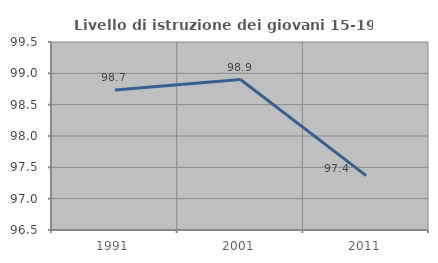
| Category | Livello di istruzione dei giovani 15-19 anni |
|---|---|
| 1991.0 | 98.734 |
| 2001.0 | 98.901 |
| 2011.0 | 97.368 |